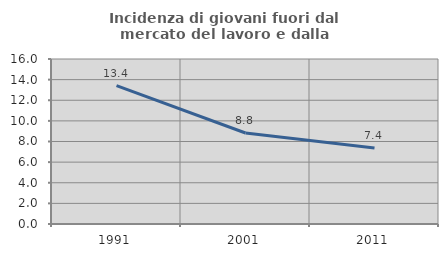
| Category | Incidenza di giovani fuori dal mercato del lavoro e dalla formazione  |
|---|---|
| 1991.0 | 13.422 |
| 2001.0 | 8.825 |
| 2011.0 | 7.372 |